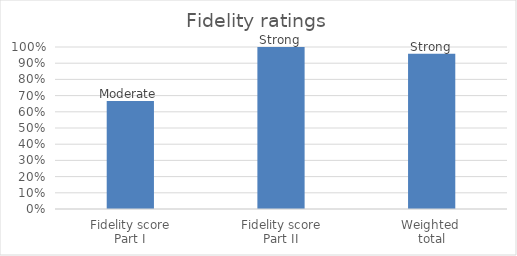
| Category | Series 0 |
|---|---|
| Fidelity score
Part I | 0.667 |
| Fidelity score
Part II | 1 |
| Weighted 
total | 0.958 |